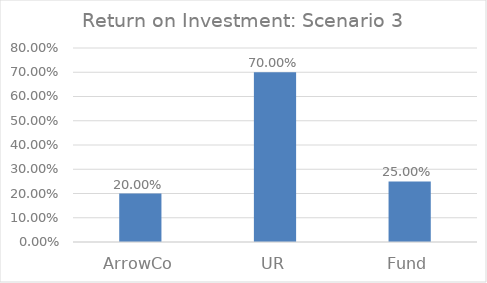
| Category | Series 0 |
|---|---|
| ArrowCo | 0.2 |
| UR | 0.7 |
| Fund | 0.25 |